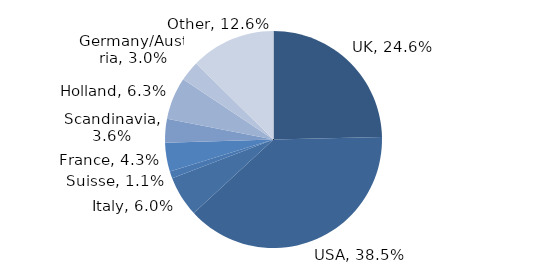
| Category | Investment Style |
|---|---|
| UK | 0.246 |
| USA | 0.385 |
| Italy | 0.06 |
| Suisse | 0.011 |
| France | 0.043 |
| Scandinavia | 0.036 |
| Holland | 0.063 |
| Germany/Austria | 0.03 |
| Other | 0.126 |